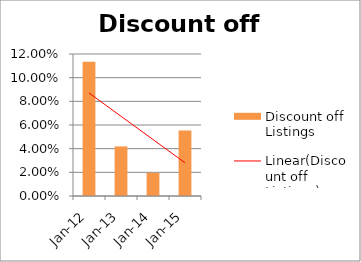
| Category | Discount off Listings |
|---|---|
| 2012-01-01 | 0.113 |
| 2013-01-01 | 0.042 |
| 2014-01-01 | 0.02 |
| 2015-01-01 | 0.055 |